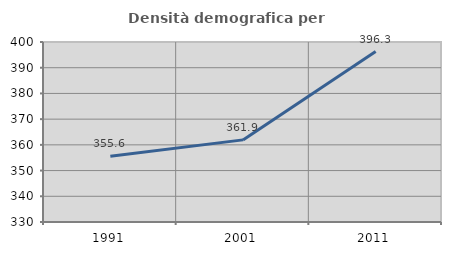
| Category | Densità demografica |
|---|---|
| 1991.0 | 355.58 |
| 2001.0 | 361.936 |
| 2011.0 | 396.286 |